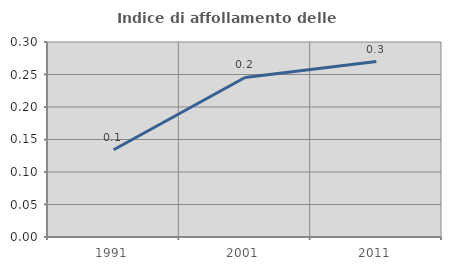
| Category | Indice di affollamento delle abitazioni  |
|---|---|
| 1991.0 | 0.134 |
| 2001.0 | 0.245 |
| 2011.0 | 0.27 |